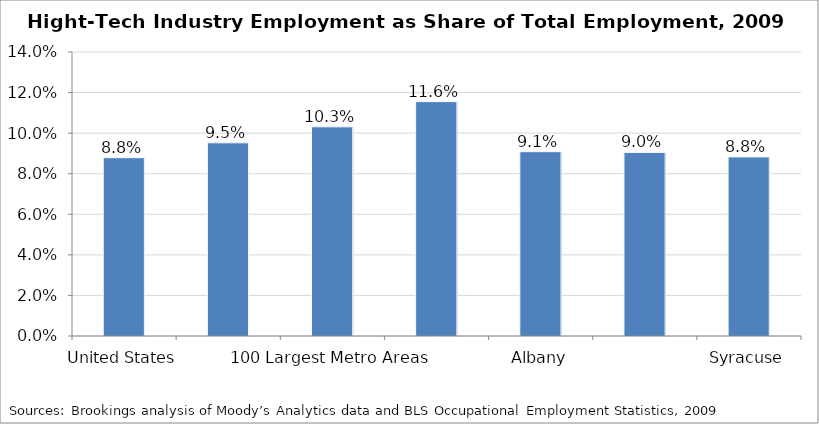
| Category | High-Tech Industry Employment as a Share of Total Employment |
|---|---|
| United States | 0.088 |
| All Metro Areas | 0.095 |
| 100 Largest Metro Areas | 0.103 |
| Rochester | 0.116 |
| Albany | 0.091 |
| Buffalo | 0.09 |
| Syracuse | 0.088 |